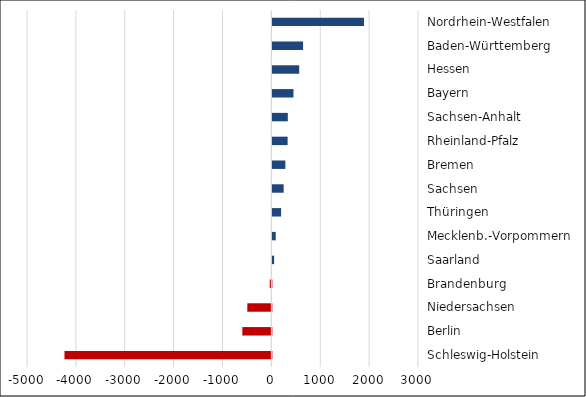
| Category | Series 0 |
|---|---|
| Schleswig-Holstein | -4233 |
| Berlin | -594 |
| Niedersachsen | -492 |
| Brandenburg | -33 |
| Saarland | 36 |
| Mecklenb.-Vorpommern | 69 |
| Thüringen | 179 |
| Sachsen | 231 |
| Bremen | 266 |
| Rheinland-Pfalz | 312 |
| Sachsen-Anhalt | 316 |
| Bayern | 432 |
| Hessen | 549 |
| Baden-Württemberg | 628 |
| Nordrhein-Westfalen | 1875 |